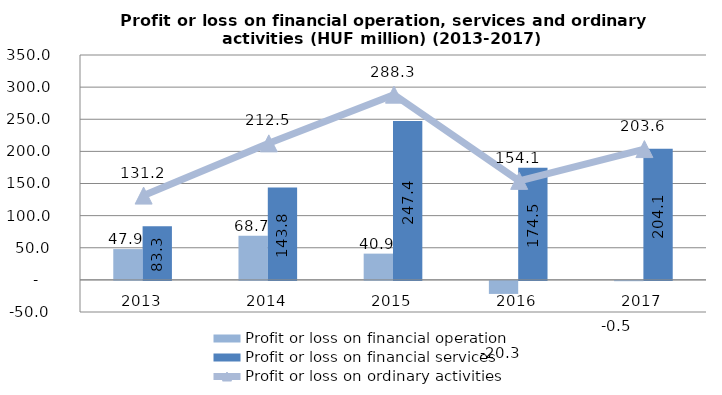
| Category | Profit or loss on financial operation | Profit or loss on financial services |
|---|---|---|
| 2013.0 | 47.9 | 83.3 |
| 2014.0 | 68.7 | 143.8 |
| 2015.0 | 40.852 | 247.438 |
| 2016.0 | -20.3 | 174.5 |
| 2017.0 | -0.5 | 204.107 |